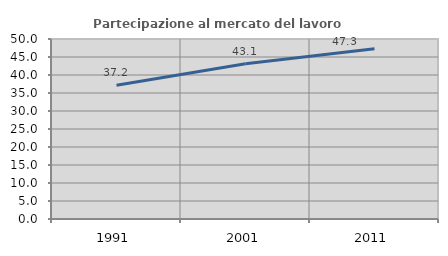
| Category | Partecipazione al mercato del lavoro  femminile |
|---|---|
| 1991.0 | 37.151 |
| 2001.0 | 43.126 |
| 2011.0 | 47.314 |